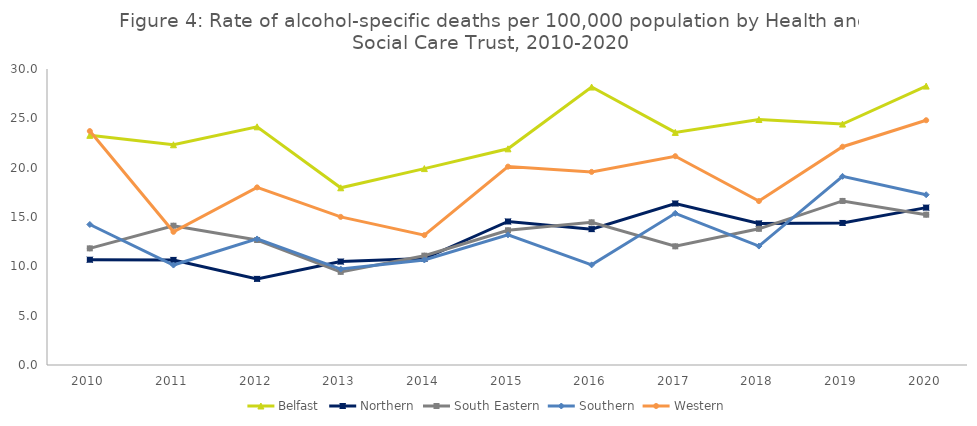
| Category | Belfast | Northern | South Eastern | Southern | Western |
|---|---|---|---|---|---|
| 2010 | 23.275 | 10.67 | 11.823 | 14.241 | 23.709 |
| 2011 | 22.32 | 10.651 | 14.115 | 10.13 | 13.498 |
| 2012 | 24.141 | 8.728 | 12.667 | 12.776 | 18.002 |
| 2013 | 17.96 | 10.483 | 9.439 | 9.723 | 15.012 |
| 2014 | 19.905 | 10.785 | 11.081 | 10.647 | 13.159 |
| 2015 | 21.91 | 14.545 | 13.654 | 13.191 | 20.105 |
| 2016 | 28.171 | 13.771 | 14.461 | 10.149 | 19.572 |
| 2017 | 23.573 | 16.37 | 12.029 | 15.374 | 21.161 |
| 2018 | 24.881 | 14.349 | 13.804 | 12.053 | 16.614 |
| 2019 | 24.419 | 14.397 | 16.627 | 19.122 | 22.123 |
| 2020 | 28.267 | 15.95 | 15.233 | 17.256 | 24.807 |